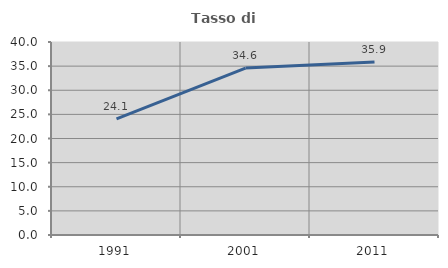
| Category | Tasso di occupazione   |
|---|---|
| 1991.0 | 24.062 |
| 2001.0 | 34.602 |
| 2011.0 | 35.871 |